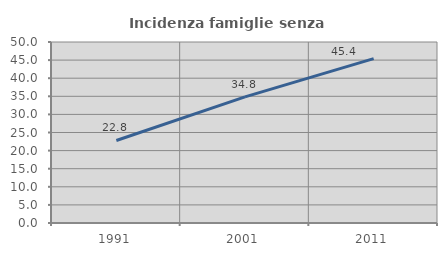
| Category | Incidenza famiglie senza nuclei |
|---|---|
| 1991.0 | 22.791 |
| 2001.0 | 34.842 |
| 2011.0 | 45.411 |